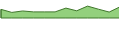
| Category | Series 0 |
|---|---|
| 0 | 48 |
| 1 | 31 |
| 2 | 39 |
| 3 | 34 |
| 4 | 34 |
| 5 | 34 |
| 6 | 55 |
| 7 | 40 |
| 8 | 66 |
| 9 | 49 |
| 10 | 33 |
| 11 | 62 |